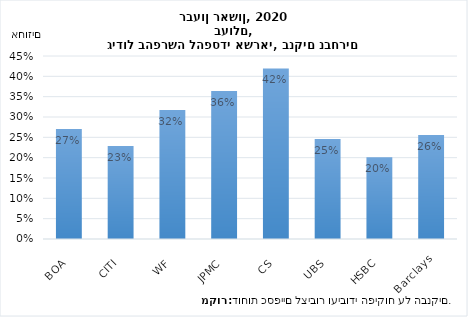
| Category | גידול בהפרשה להפסדי אשראי |
|---|---|
| BOA | 0.27 |
| CITI | 0.229 |
| WF | 0.317 |
| JPMC | 0.364 |
| CS | 0.419 |
| UBS | 0.246 |
| HSBC | 0.201 |
| Barclays | 0.256 |